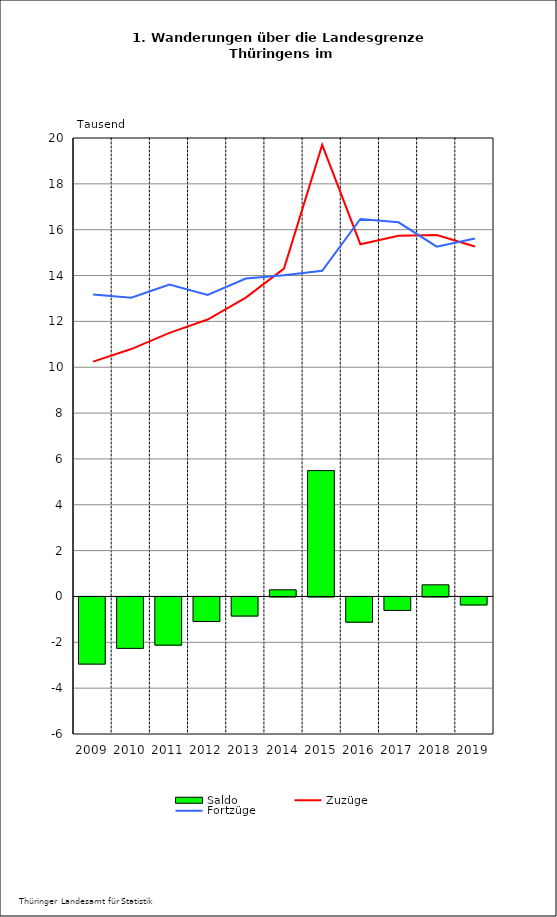
| Category | Saldo |
|---|---|
| 2009.0 | -2.929 |
| 2010.0 | -2.242 |
| 2011.0 | -2.102 |
| 2012.0 | -1.071 |
| 2013.0 | -0.832 |
| 2014.0 | 0.29 |
| 2015.0 | 5.49 |
| 2016.0 | -1.1 |
| 2017.0 | -0.587 |
| 2018.0 | 0.508 |
| 2019.0 | -0.349 |